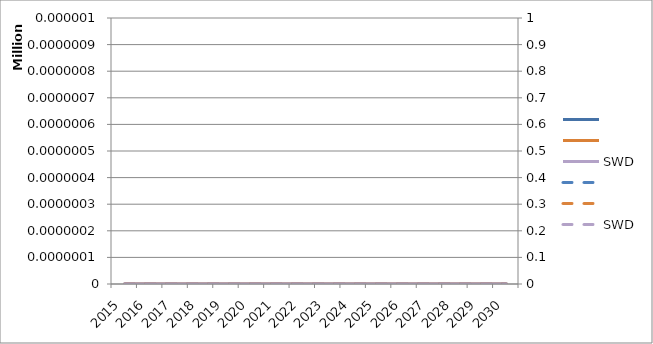
| Category | LRP | GRP | SWD |
|---|---|---|---|
| 2015.0 | 30407332.69 | 8828871.071 | 0 |
| 2016.0 | 30379390.486 | 9005983.029 | 0 |
| 2017.0 | 28754207.89 | 8816368.429 | 0 |
| 2018.0 | 27965984.669 | 8933584.39 | 0 |
| 2019.0 | 26937927.427 | 9067326.066 | 0 |
| 2020.0 | 16767020.773 | 9242772.915 | 0 |
| 2021.0 | 17056944.26 | 8415222.985 | 0 |
| 2022.0 | 17152797.424 | 8489005.756 | 0 |
| 2023.0 | 14838733.908 | 8322173.745 | 0 |
| 2024.0 | 14732796.208 | 8521793.516 | 0 |
| 2025.0 | 14160967.468 | 7057966.905 | 0 |
| 2026.0 | 17056944.26 | 7079067.682 | 0 |
| 2027.0 | 14600620.69 | 6733355.542 | 0 |
| 2028.0 | 14821567.029 | 6742084.276 | 0 |
| 2029.0 | 14765446.949 | 1885813.01 | 0 |
| 2030.0 | 3318461.627 | 1894541.744 | 0 |